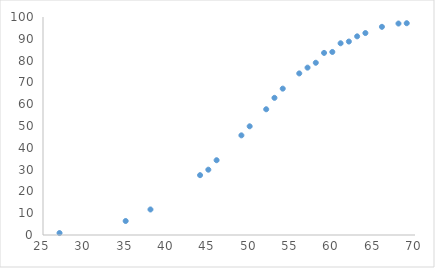
| Category | Mortality |
|---|---|
| 27.0 | 0.9 |
| 35.0 | 6.42 |
| 38.0 | 11.71 |
| 44.0 | 27.45 |
| 45.0 | 29.96 |
| 46.0 | 34.3 |
| 49.0 | 45.71 |
| 50.0 | 49.86 |
| 52.0 | 57.68 |
| 53.0 | 62.92 |
| 54.0 | 67.14 |
| 56.0 | 74.12 |
| 57.0 | 76.77 |
| 58.0 | 79.01 |
| 59.0 | 83.53 |
| 60.0 | 83.96 |
| 61.0 | 87.95 |
| 62.0 | 88.74 |
| 63.0 | 91.13 |
| 64.0 | 92.64 |
| 66.0 | 95.49 |
| 68.0 | 97 |
| 69.0 | 97.15 |